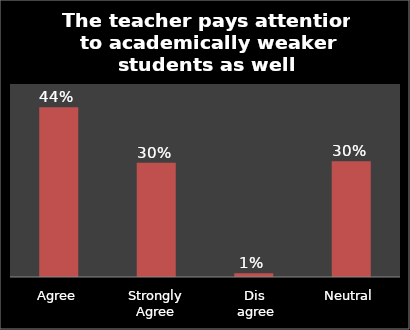
| Category | Series 0 |
|---|---|
| Agree | 0.44 |
| Strongly Agree | 0.296 |
| Dis
 agree | 0.01 |
| Neutral | 0.3 |